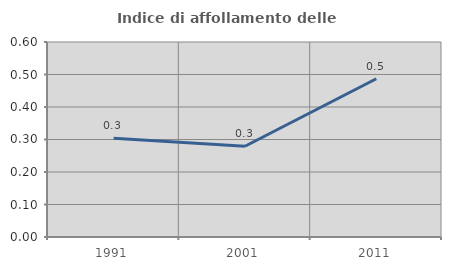
| Category | Indice di affollamento delle abitazioni  |
|---|---|
| 1991.0 | 0.304 |
| 2001.0 | 0.279 |
| 2011.0 | 0.487 |